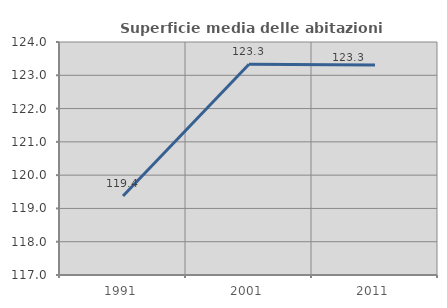
| Category | Superficie media delle abitazioni occupate |
|---|---|
| 1991.0 | 119.373 |
| 2001.0 | 123.33 |
| 2011.0 | 123.306 |